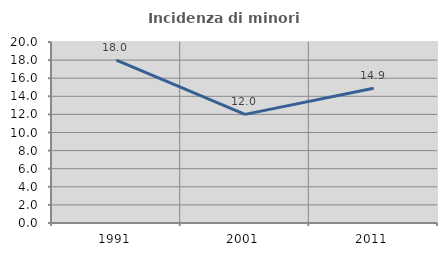
| Category | Incidenza di minori stranieri |
|---|---|
| 1991.0 | 18 |
| 2001.0 | 12 |
| 2011.0 | 14.887 |